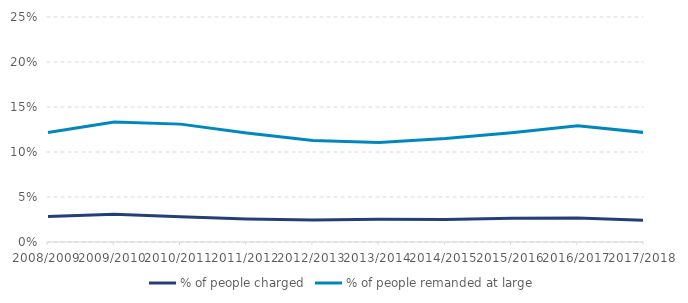
| Category | % of people charged | % of people remanded at large |
|---|---|---|
| 2008/2009 | 0.028 | 0.122 |
| 2009/2010 | 0.031 | 0.133 |
| 2010/2011 | 0.028 | 0.131 |
| 2011/2012 | 0.026 | 0.121 |
| 2012/2013 | 0.024 | 0.113 |
| 2013/2014 | 0.025 | 0.11 |
| 2014/2015 | 0.025 | 0.115 |
| 2015/2016 | 0.026 | 0.121 |
| 2016/2017 | 0.027 | 0.129 |
| 2017/2018 | 0.024 | 0.122 |